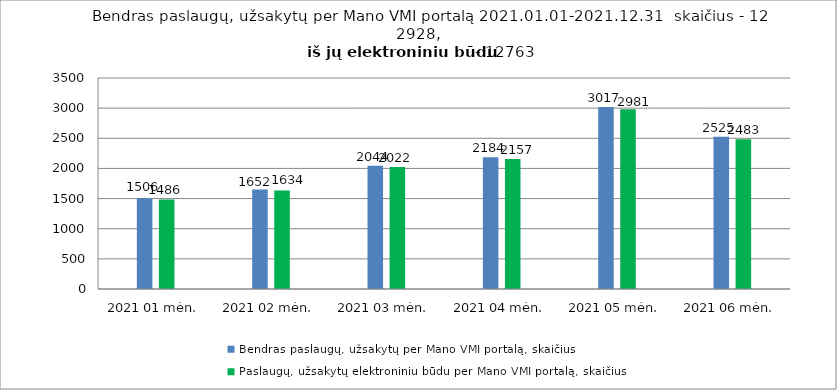
| Category | Bendras paslaugų, užsakytų per Mano VMI portalą, skaičius | Paslaugų, užsakytų elektroniniu būdu per Mano VMI portalą, skaičius |
|---|---|---|
| 2021 01 mėn. | 1506 | 1486 |
| 2021 02 mėn. | 1652 | 1634 |
| 2021 03 mėn. | 2044 | 2022 |
| 2021 04 mėn. | 2184 | 2157 |
| 2021 05 mėn. | 3017 | 2981 |
| 2021 06 mėn. | 2525 | 2483 |